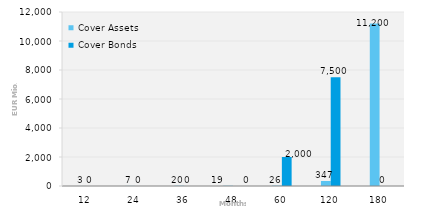
| Category | Cover Assets | Cover Bonds |
|---|---|---|
| 12.0 | 3.21 | 0 |
| 24.0 | 7.46 | 0 |
| 36.0 | 19.935 | 0 |
| 48.0 | 19.17 | 0 |
| 60.0 | 26.414 | 2000 |
| 120.0 | 346.923 | 7500 |
| 180.0 | 11200.391 | 0 |